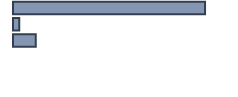
| Category | Series 0 |
|---|---|
| 0 | 86.9 |
| 1 | 2.8 |
| 2 | 10.3 |
| 3 | 0 |
| 4 | 0 |